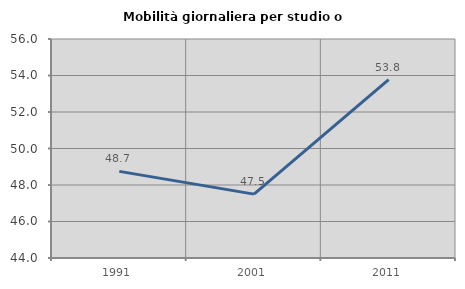
| Category | Mobilità giornaliera per studio o lavoro |
|---|---|
| 1991.0 | 48.746 |
| 2001.0 | 47.5 |
| 2011.0 | 53.769 |